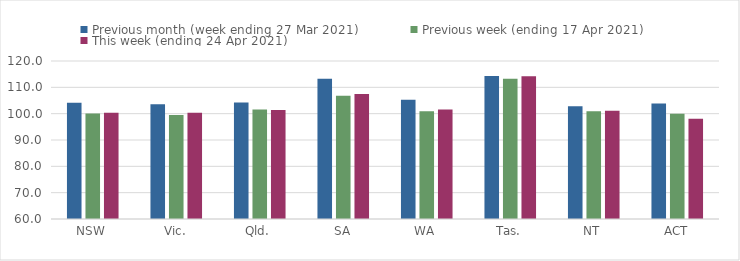
| Category | Previous month (week ending 27 Mar 2021) | Previous week (ending 17 Apr 2021) | This week (ending 24 Apr 2021) |
|---|---|---|---|
| NSW | 104.13 | 100.06 | 100.31 |
| Vic. | 103.57 | 99.48 | 100.33 |
| Qld. | 104.2 | 101.55 | 101.36 |
| SA | 113.26 | 106.78 | 107.46 |
| WA | 105.27 | 100.9 | 101.56 |
| Tas. | 114.35 | 113.24 | 114.18 |
| NT | 102.81 | 100.91 | 101.14 |
| ACT | 103.88 | 99.93 | 98.09 |